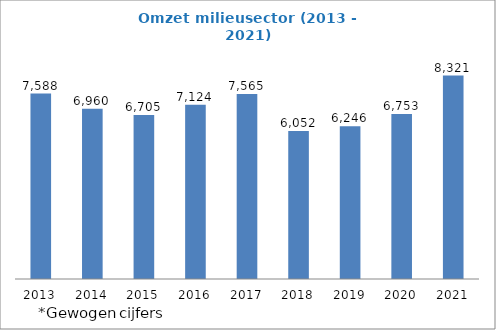
| Category | Omzet |
|---|---|
| 2013.0 | 7587.721 |
| 2014.0 | 6960.338 |
| 2015.0 | 6705.293 |
| 2016.0 | 7124.017 |
| 2017.0 | 7564.955 |
| 2018.0 | 6052.103 |
| 2019.0 | 6246.47 |
| 2020.0 | 6753.301 |
| 2021.0 | 8321.006 |